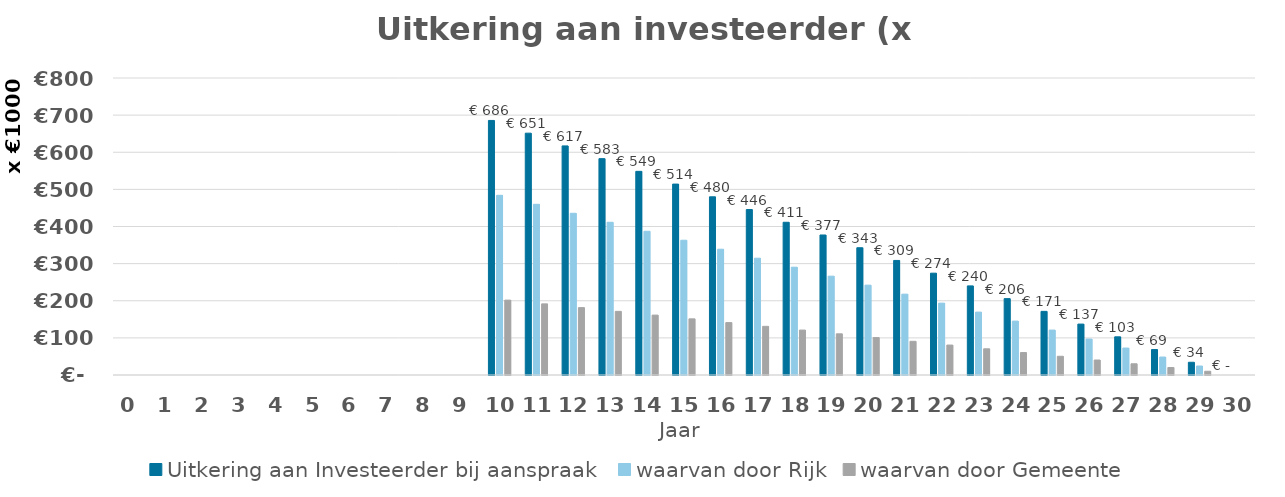
| Category | Uitkering aan Investeerder bij aanspraak | waarvan door Rijk | waarvan door Gemeente |
|---|---|---|---|
| 0.0 | 0 | 0 | 0 |
| 1.0 | 0 | 0 | 0 |
| 2.0 | 0 | 0 | 0 |
| 3.0 | 0 | 0 | 0 |
| 4.0 | 0 | 0 | 0 |
| 5.0 | 0 | 0 | 0 |
| 6.0 | 0 | 0 | 0 |
| 7.0 | 0 | 0 | 0 |
| 8.0 | 0 | 0 | 0 |
| 9.0 | 0 | 0 | 0 |
| 10.0 | 685665.817 | 483999.4 | 201666.417 |
| 11.0 | 651382.483 | 459799.4 | 191583.083 |
| 12.0 | 617099.15 | 435599.4 | 181499.75 |
| 13.0 | 582815.817 | 411399.4 | 171416.417 |
| 14.0 | 548532.483 | 387199.4 | 161333.083 |
| 15.0 | 514249.15 | 362999.4 | 151249.75 |
| 16.0 | 479965.817 | 338799.4 | 141166.417 |
| 17.0 | 445682.483 | 314599.4 | 131083.083 |
| 18.0 | 411399.15 | 290399.4 | 120999.75 |
| 19.0 | 377115.817 | 266199.4 | 110916.417 |
| 20.0 | 342832.483 | 241999.4 | 100833.083 |
| 21.0 | 308549.15 | 217799.4 | 90749.75 |
| 22.0 | 274265.817 | 193599.4 | 80666.417 |
| 23.0 | 239982.483 | 169399.4 | 70583.083 |
| 24.0 | 205699.15 | 145199.4 | 60499.75 |
| 25.0 | 171415.817 | 120999.4 | 50416.417 |
| 26.0 | 137132.483 | 96799.4 | 40333.083 |
| 27.0 | 102849.15 | 72599.4 | 30249.75 |
| 28.0 | 68565.817 | 48399.4 | 20166.417 |
| 29.0 | 34282.483 | 24199.4 | 10083.083 |
| 30.0 | 0 | 0 | 0 |